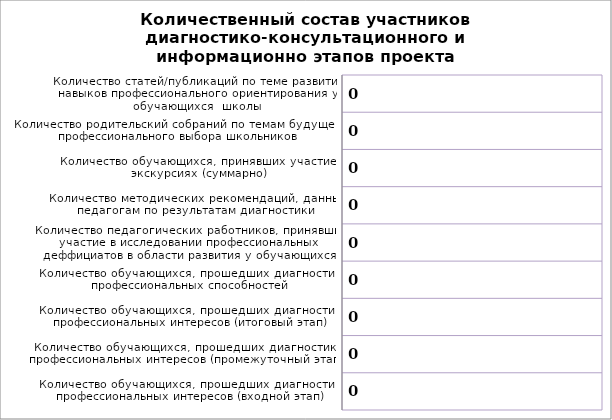
| Category | Series 0 |
|---|---|
| Количество обучающихся, прошедших диагностику профессиональных интересов (входной этап) | 0 |
| Количество обучающихся, прошедших диагностику профессиональных интересов (промежуточный этап) | 0 |
| Количество обучающихся, прошедших диагностику профессиональных интересов (итоговый этап) | 0 |
| Количество обучающихся, прошедших диагностику профессиональных способностей | 0 |
| Количество педагогических работников, принявших участие в исследовании профессиональных деффициатов в области развития у обучающихся навыков их профессионального самоопределения | 0 |
| Количество методических рекомендаций, данных педагогам по результатам диагностики | 0 |
| Количество обучающихся, принявших участие в экскурсиях (суммарно) | 0 |
| Количество родительский собраний по темам будущего профессионального выбора школьников | 0 |
| Количество статей/публикаций по теме развития навыков профессионального ориентирования у обучающихся  школы | 0 |